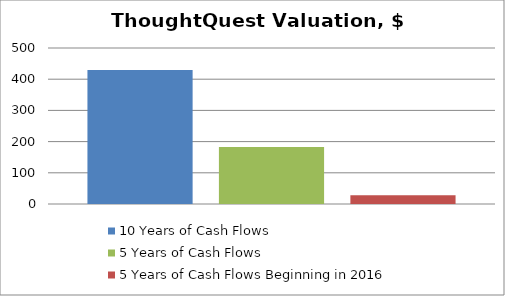
| Category | 10 Years of Cash Flows | 5 Years of Cash Flows | 5 Years of Cash Flows Beginning in 2016 |
|---|---|---|---|
| 0 | 429.093 | 183.019 | 28.074 |